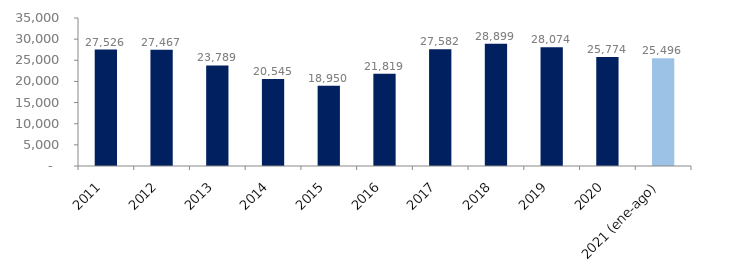
| Category | Series 1 |
|---|---|
| 2011 | 27525.675 |
| 2012 | 27466.673 |
| 2013 | 23789.445 |
| 2014 | 20545.414 |
| 2015 | 18950.14 |
| 2016 | 21819.079 |
| 2017 | 27581.607 |
| 2018 | 28898.658 |
| 2019 | 28073.793 |
| 2020 | 25773.552 |
| 2021 (ene-ago) | 25495.896 |